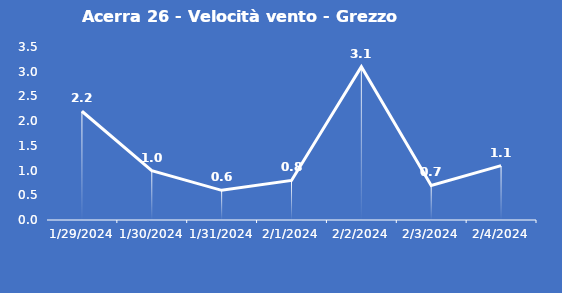
| Category | Acerra 26 - Velocità vento - Grezzo (m/s) |
|---|---|
| 1/29/24 | 2.2 |
| 1/30/24 | 1 |
| 1/31/24 | 0.6 |
| 2/1/24 | 0.8 |
| 2/2/24 | 3.1 |
| 2/3/24 | 0.7 |
| 2/4/24 | 1.1 |